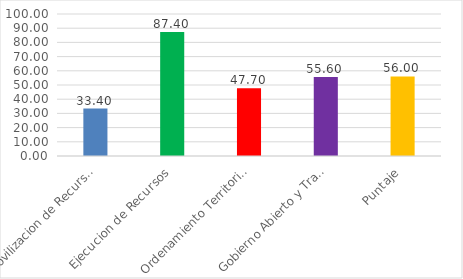
| Category | Series 0 |
|---|---|
| Movilizacion de Recursos | 33.4 |
| Ejecucion de Recursos | 87.4 |
| Ordenamiento Territorial | 47.7 |
| Gobierno Abierto y Transparencia | 55.6 |
| Puntaje | 56 |